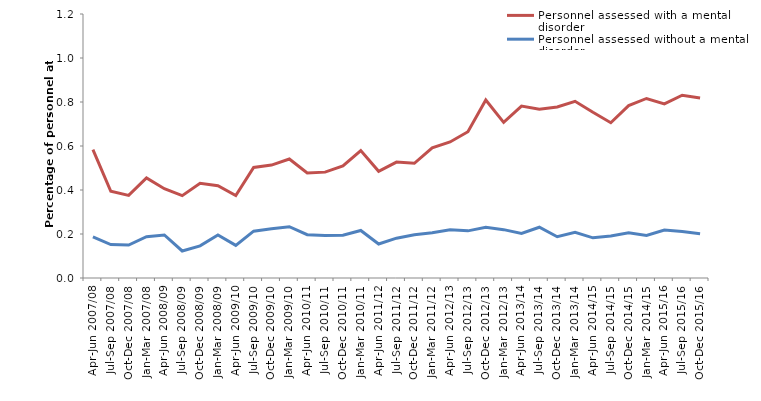
| Category | Personnel assessed with a mental disorder | Personnel assessed without a mental disorder |
|---|---|---|
| Apr-Jun 2007/08 | 0.584 | 0.187 |
| Jul-Sep 2007/08 | 0.394 | 0.152 |
| Oct-Dec 2007/08 | 0.375 | 0.15 |
| Jan-Mar 2007/08 | 0.455 | 0.188 |
| Apr-Jun 2008/09 | 0.406 | 0.195 |
| Jul-Sep 2008/09 | 0.374 | 0.123 |
| Oct-Dec 2008/09 | 0.431 | 0.146 |
| Jan-Mar 2008/09 | 0.419 | 0.196 |
| Apr-Jun 2009/10 | 0.375 | 0.148 |
| Jul-Sep 2009/10 | 0.502 | 0.213 |
| Oct-Dec 2009/10 | 0.513 | 0.224 |
| Jan-Mar 2009/10 | 0.541 | 0.233 |
| Apr-Jun 2010/11 | 0.477 | 0.197 |
| Jul-Sep 2010/11 | 0.481 | 0.193 |
| Oct-Dec 2010/11 | 0.509 | 0.194 |
| Jan-Mar 2010/11 | 0.579 | 0.216 |
| Apr-Jun 2011/12 | 0.485 | 0.155 |
| Jul-Sep 2011/12 | 0.527 | 0.181 |
| Oct-Dec 2011/12 | 0.521 | 0.197 |
| Jan-Mar 2011/12 | 0.591 | 0.205 |
| Apr-Jun 2012/13 | 0.618 | 0.22 |
| Jul-Sep 2012/13 | 0.665 | 0.214 |
| Oct-Dec 2012/13 | 0.809 | 0.23 |
| Jan-Mar 2012/13 | 0.707 | 0.22 |
| Apr-Jun 2013/14 | 0.782 | 0.203 |
| Jul-Sep 2013/14 | 0.767 | 0.231 |
| Oct-Dec 2013/14 | 0.777 | 0.187 |
| Jan-Mar 2013/14 | 0.803 | 0.208 |
| Apr-Jun 2014/15 | 0.753 | 0.183 |
| Jul-Sep 2014/15 | 0.706 | 0.191 |
| Oct-Dec 2014/15 | 0.784 | 0.205 |
| Jan-Mar 2014/15 | 0.816 | 0.193 |
| Apr-Jun 2015/16 | 0.791 | 0.218 |
| Jul-Sep 2015/16 | 0.831 | 0.212 |
| Oct-Dec 2015/16 | 0.819 | 0.202 |